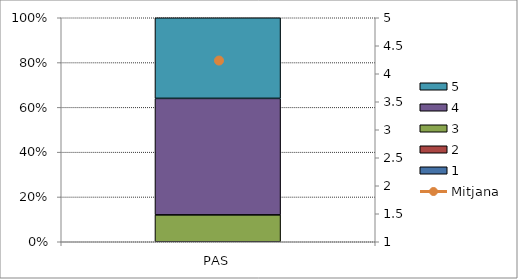
| Category | 1 | 2 | 3 | 4 | 5 |
|---|---|---|---|---|---|
| PAS | 0 | 0 | 3 | 13 | 9 |